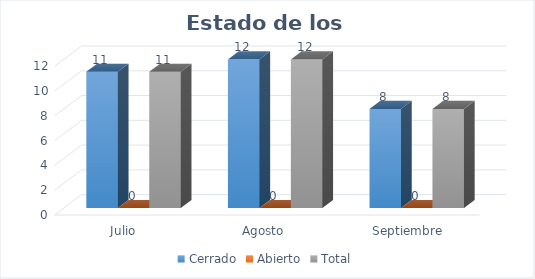
| Category | Cerrado | Abierto | Total |
|---|---|---|---|
| Julio  | 11 | 0 | 11 |
| Agosto  | 12 | 0 | 12 |
| Septiembre | 8 | 0 | 8 |